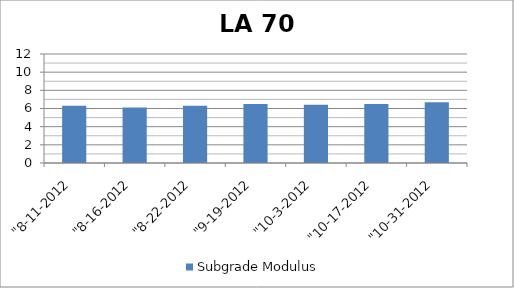
| Category | Subgrade Modulus |
|---|---|
| "8-11-2012 | 6.3 |
| "8-16-2012 | 6.1 |
| "8-22-2012 | 6.3 |
| "9-19-2012 | 6.5 |
| "10-3-2012 | 6.4 |
| "10-17-2012 | 6.5 |
| "10-31-2012 | 6.7 |